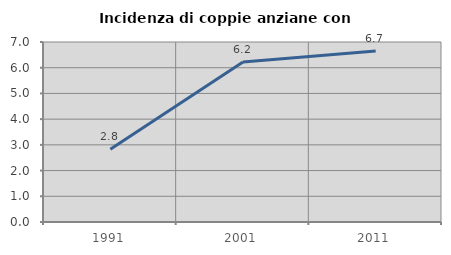
| Category | Incidenza di coppie anziane con figli |
|---|---|
| 1991.0 | 2.826 |
| 2001.0 | 6.222 |
| 2011.0 | 6.651 |